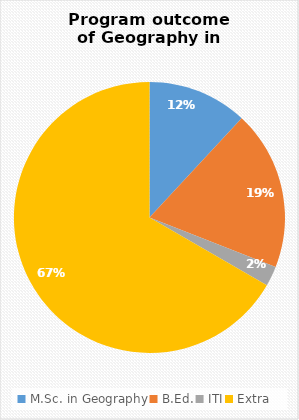
| Category | Series 0 |
|---|---|
| M.Sc. in Geography | 5 |
| B.Ed. | 8 |
| ITI | 1 |
| Extra | 28 |